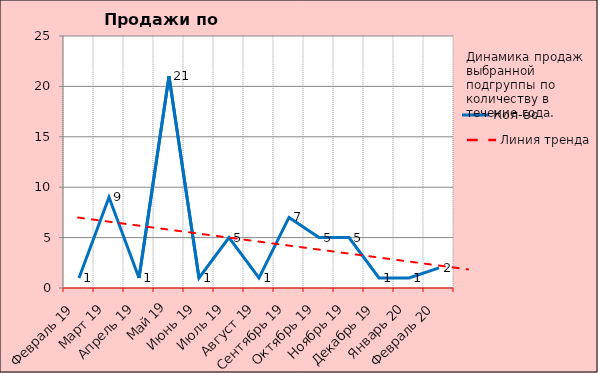
| Category | Кол-во |
|---|---|
|   Февраль 19 | 1 |
|   Март 19 | 9 |
|   Апрель 19 | 1 |
|   Май 19 | 21 |
|   Июнь 19 | 1 |
|   Июль 19 | 5 |
|   Август 19 | 1 |
|   Сентябрь 19 | 7 |
|   Октябрь 19 | 5 |
|   Ноябрь 19 | 5 |
|   Декабрь 19 | 1 |
|   Январь 20 | 1 |
|   Февраль 20 | 2 |